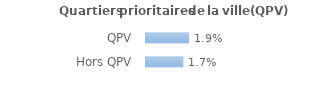
| Category | Series 0 |
|---|---|
| QPV | 0.019 |
| Hors QPV | 0.017 |